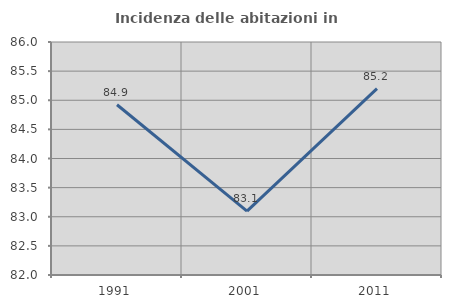
| Category | Incidenza delle abitazioni in proprietà  |
|---|---|
| 1991.0 | 84.922 |
| 2001.0 | 83.096 |
| 2011.0 | 85.2 |